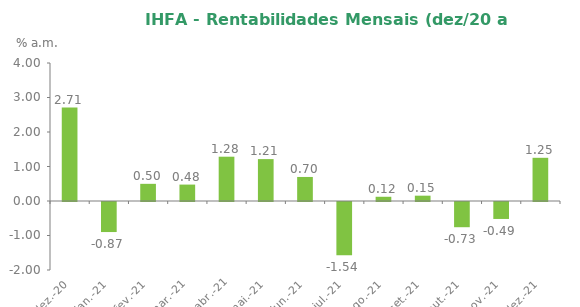
| Category | Series 0 |
|---|---|
| 2020-12-31 | 2.707 |
| 2021-01-31 | -0.871 |
| 2021-02-28 | 0.498 |
| 2021-03-31 | 0.476 |
| 2021-04-30 | 1.284 |
| 2021-05-31 | 1.214 |
| 2021-06-30 | 0.697 |
| 2021-07-31 | -1.541 |
| 2021-08-31 | 0.123 |
| 2021-09-30 | 0.154 |
| 2021-10-31 | -0.731 |
| 2021-11-30 | -0.492 |
| 2021-12-31 | 1.252 |